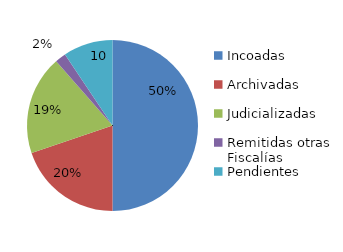
| Category | Series 0 |
|---|---|
| Incoadas | 48 |
| Archivadas | 19 |
| Judicializadas | 18 |
| Remitidas otras Fiscalías | 2 |
| Pendientes | 9 |